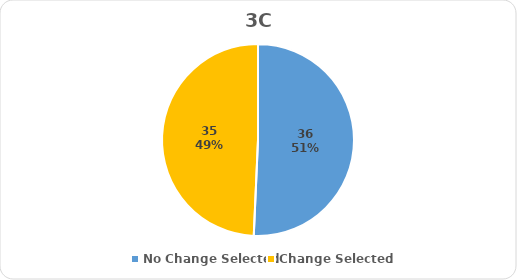
| Category | Series 0 |
|---|---|
| No Change Selected | 36 |
| Change Selected | 35 |